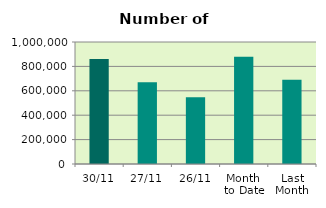
| Category | Series 0 |
|---|---|
| 30/11 | 859836 |
| 27/11 | 669500 |
| 26/11 | 546858 |
| Month 
to Date | 879957.333 |
| Last
Month | 689792.182 |